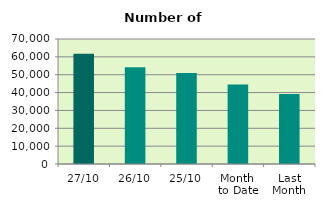
| Category | Series 0 |
|---|---|
| 27/10 | 61770 |
| 26/10 | 54146 |
| 25/10 | 50930 |
| Month 
to Date | 44492.842 |
| Last
Month | 39229.818 |